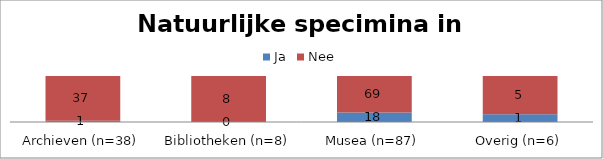
| Category | Ja | Nee |
|---|---|---|
| Archieven (n=38) | 1 | 37 |
| Bibliotheken (n=8) | 0 | 8 |
| Musea (n=87) | 18 | 69 |
| Overig (n=6) | 1 | 5 |